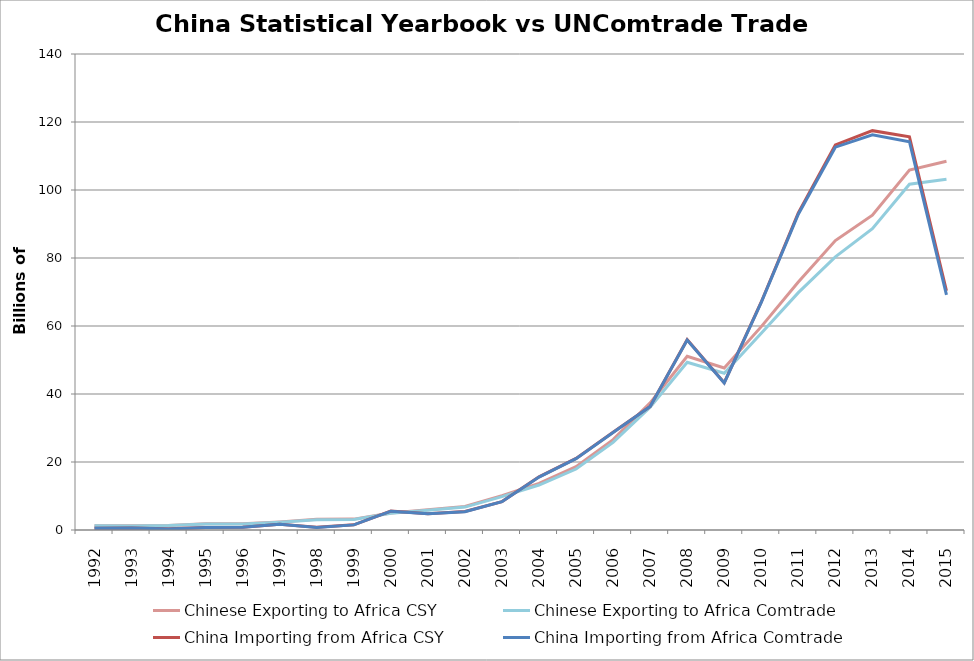
| Category | Chinese Exporting to Africa CSY | Chinese Exporting to Africa Comtrade | China Importing from Africa CSY | China Importing from Africa Comtrade |
|---|---|---|---|---|
| 1992.0 | 1.258 | 1.234 | 0.491 | 0.486 |
| 1993.0 | 1.251 | 1.211 | 0.584 | 0.577 |
| 1994.0 | 1.349 | 1.312 | 0.353 | 0.328 |
| 1995.0 | 1.822 | 1.75 | 0.733 | 0.728 |
| 1996.0 | 1.843 | 1.76 | 0.792 | 0.789 |
| 1997.0 | 2.383 | 2.297 | 1.667 | 1.665 |
| 1998.0 | 3.131 | 3.02 | 0.778 | 0.769 |
| 1999.0 | 3.2 | 3.089 | 1.511 | 1.506 |
| 2000.0 | 5.008 | 4.901 | 5.555 | 5.54 |
| 2001.0 | 5.963 | 5.814 | 4.793 | 4.756 |
| 2002.0 | 6.92 | 6.736 | 5.427 | 5.397 |
| 2003.0 | 10.127 | 9.803 | 8.36 | 8.326 |
| 2004.0 | 13.732 | 13.22 | 15.646 | 15.564 |
| 2005.0 | 18.605 | 17.931 | 21.062 | 20.966 |
| 2006.0 | 26.587 | 25.781 | 28.771 | 28.691 |
| 2007.0 | 37.381 | 36.145 | 36.36 | 36.306 |
| 2008.0 | 51.095 | 49.341 | 55.967 | 55.873 |
| 2009.0 | 47.639 | 46.101 | 43.33 | 43.25 |
| 2010.0 | 59.812 | 57.875 | 67.066 | 66.943 |
| 2011.0 | 72.923 | 69.809 | 93.234 | 92.87 |
| 2012.0 | 85.139 | 80.343 | 113.244 | 112.601 |
| 2013.0 | 92.576 | 88.625 | 117.454 | 116.251 |
| 2014.0 | 105.84 | 101.699 | 115.659 | 114.206 |
| 2015.0 | 108.435 | 103.191 | 70.366 | 69.172 |